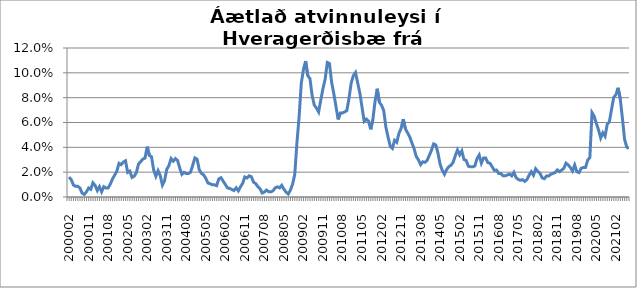
| Category | Series 0 |
|---|---|
| 200002 | 0.016 |
| 200003 | 0.014 |
| 200004 | 0.01 |
| 200005 | 0.009 |
| 200006 | 0.009 |
| 200007 | 0.007 |
| 200008 | 0.003 |
| 200009 | 0.002 |
| 200010 | 0.004 |
| 200011 | 0.007 |
| 200012 | 0.006 |
| 200101 | 0.011 |
| 200102 | 0.009 |
| 200103 | 0.005 |
| 200104 | 0.008 |
| 200105 | 0.004 |
| 200106 | 0.008 |
| 200107 | 0.007 |
| 200108 | 0.007 |
| 200109 | 0.01 |
| 200110 | 0.015 |
| 200111 | 0.018 |
| 200112 | 0.021 |
| 200201 | 0.027 |
| 200202 | 0.026 |
| 200203 | 0.028 |
| 200204 | 0.029 |
| 200205 | 0.02 |
| 200206 | 0.021 |
| 200207 | 0.016 |
| 200208 | 0.017 |
| 200209 | 0.02 |
| 200210 | 0.027 |
| 200211 | 0.029 |
| 200212 | 0.031 |
| 200301 | 0.031 |
| 200302 | 0.041 |
| 200303 | 0.033 |
| 200304 | 0.032 |
| 200305 | 0.022 |
| 200306 | 0.017 |
| 200307 | 0.021 |
| 200308 | 0.017 |
| 200309 | 0.01 |
| 200310 | 0.013 |
| 200311 | 0.022 |
| 200312 | 0.025 |
| 200401 | 0.031 |
| 200402 | 0.029 |
| 200403 | 0.031 |
| 200404 | 0.029 |
| 200405 | 0.023 |
| 200406 | 0.018 |
| 200407 | 0.02 |
| 200408 | 0.019 |
| 200409 | 0.019 |
| 200410 | 0.02 |
| 200411 | 0.026 |
| 200412 | 0.031 |
| 200501 | 0.03 |
| 200502 | 0.022 |
| 200503 | 0.019 |
| 200504 | 0.018 |
| 200505 | 0.015 |
| 200506 | 0.011 |
| 200507 | 0.011 |
| 200508 | 0.01 |
| 200509 | 0.01 |
| 200510 | 0.009 |
| 200511 | 0.015 |
| 200512 | 0.016 |
| 200601 | 0.013 |
| 200602 | 0.01 |
| 200603 | 0.007 |
| 200604 | 0.007 |
| 200605 | 0.006 |
| 200606 | 0.005 |
| 200607 | 0.007 |
| 200608 | 0.005 |
| 200609 | 0.008 |
| 200610 | 0.011 |
| 200611 | 0.016 |
| 200612 | 0.015 |
| 200701 | 0.017 |
| 200702 | 0.016 |
| 200703 | 0.012 |
| 200704 | 0.011 |
| 200705 | 0.008 |
| 200706 | 0.007 |
| 200707 | 0.003 |
| 200708 | 0.004 |
| 200709 | 0.006 |
| 200710 | 0.004 |
| 200711 | 0.004 |
| 200712 | 0.005 |
| 200801 | 0.007 |
| 200802 | 0.008 |
| 200803 | 0.007 |
| 200804 | 0.009 |
| 200805 | 0.006 |
| 200806 | 0.004 |
| 200807 | 0.002 |
| 200808 | 0.006 |
| 200809 | 0.01 |
| 200810 | 0.018 |
| 200811 | 0.044 |
| 200812 | 0.064 |
| 200901 | 0.092 |
| 200902 | 0.103 |
| 200903 | 0.109 |
| 200904 | 0.098 |
| 200905 | 0.095 |
| 200906 | 0.082 |
| 200907 | 0.074 |
| 200908 | 0.072 |
| 200909 | 0.068 |
| 200910 | 0.078 |
| 200911 | 0.087 |
| 200912 | 0.095 |
| 201001 | 0.108 |
| 201002 | 0.107 |
| 201003 | 0.092 |
| 201004 | 0.083 |
| 201005 | 0.073 |
| 201006 | 0.062 |
| 201007 | 0.068 |
| 201008 | 0.068 |
| 201009 | 0.068 |
| 201010 | 0.07 |
| 201011 | 0.079 |
| 201012 | 0.092 |
| 201101 | 0.098 |
| 201102 | 0.1 |
| 201103 | 0.092 |
| 201104 | 0.084 |
| 201105 | 0.072 |
| 201106 | 0.061 |
| 201107 | 0.063 |
| 201108 | 0.061 |
| 201109 | 0.055 |
| 201110 | 0.062 |
| 201111 | 0.077 |
| 201112 | 0.087 |
| 201201 | 0.076 |
| 201202 | 0.074 |
| 201203 | 0.07 |
| 201204 | 0.056 |
| 201205 | 0.048 |
| 201206 | 0.041 |
| 201207 | 0.039 |
| 201208 | 0.046 |
| 201209 | 0.044 |
| 201210 | 0.051 |
| 201211 | 0.055 |
| 201212 | 0.063 |
| 201301 | 0.055 |
| 201302 | 0.052 |
| 201303 | 0.048 |
| 201304 | 0.044 |
| 201305 | 0.039 |
| 201306 | 0.033 |
| 201307 | 0.03 |
| 201308 | 0.026 |
| 201309 | 0.028 |
| 201310 | 0.028 |
| 201311 | 0.029 |
| 201312 | 0.033 |
| 201401 | 0.038 |
| 201402 | 0.043 |
| 201403 | 0.042 |
| 201404 | 0.035 |
| 201405 | 0.026 |
| 201406 | 0.021 |
| 201407 | 0.018 |
| 201408 | 0.022 |
| 201409 | 0.024 |
| 201410 | 0.026 |
| 201411 | 0.028 |
| 201412 | 0.033 |
| 201501 | 0.038 |
| 201502 | 0.034 |
| 201503 | 0.037 |
| 201504 | 0.03 |
| 201505 | 0.029 |
| 201506 | 0.025 |
| 201507 | 0.024 |
| 201508 | 0.024 |
| 201509 | 0.025 |
| 201510 | 0.031 |
| 201511 | 0.034 |
| 201512 | 0.027 |
| 201601 | 0.031 |
| 201602 | 0.031 |
| 201603 | 0.028 |
| 201604 | 0.027 |
| 201605 | 0.024 |
| 201606 | 0.021 |
| 201607 | 0.022 |
| 201608 | 0.019 |
| 201609 | 0.019 |
| 201610 | 0.017 |
| 201611 | 0.017 |
| 201612 | 0.018 |
| 201701 | 0.018 |
| 201702 | 0.017 |
| 201703 | 0.02 |
| 201704 | 0.016 |
| 201705 | 0.014 |
| 201706 | 0.013 |
| 201707 | 0.014 |
| 201708 | 0.013 |
| 201709 | 0.014 |
| 201710 | 0.018 |
| 201711 | 0.02 |
| 201712 | 0.018 |
| 201801 | 0.023 |
| 201802 | 0.021 |
| 201803 | 0.019 |
| 201804 | 0.015 |
| 201805 | 0.015 |
| 201806 | 0.017 |
| 201807 | 0.017 |
| 201808 | 0.018 |
| 201809 | 0.019 |
| 201810 | 0.02 |
| 201811 | 0.022 |
| 201812 | 0.02 |
| 201901 | 0.022 |
| 201902 | 0.023 |
| 201903 | 0.027 |
| 201904 | 0.026 |
| 201905 | 0.024 |
| 201906 | 0.021 |
| 201907 | 0.026 |
| 201908 | 0.02 |
| 201909 | 0.02 |
| 201910 | 0.023 |
| 201911 | 0.024 |
| 201912 | 0.024 |
| 202001 | 0.03 |
| 202002 | 0.032 |
| 202003 | 0.068 |
| 202004 | 0.065 |
| 202005 | 0.059 |
| 202006 | 0.054 |
| 202007 | 0.048 |
| 202008 | 0.052 |
| 202009 | 0.049 |
| 202010 | 0.059 |
| 202011 | 0.061 |
| 202012 | 0.071 |
| 202101 | 0.08 |
| 202102 | 0.082 |
| 202103 | 0.088 |
| 202104 | 0.079 |
| 202105 | 0.063 |
| 202106 | 0.046 |
| 202107 | 0.04 |
| 202108 | 0.039 |